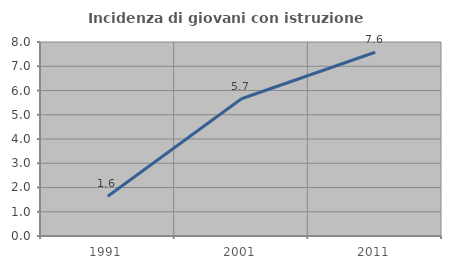
| Category | Incidenza di giovani con istruzione universitaria |
|---|---|
| 1991.0 | 1.639 |
| 2001.0 | 5.66 |
| 2011.0 | 7.576 |